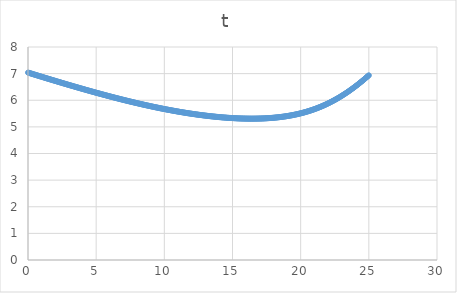
| Category | t |
|---|---|
| 0.0 | 7.04 |
| 0.05 | 7.032 |
| 0.1 | 7.024 |
| 0.15000000000000002 | 7.016 |
| 0.2 | 7.008 |
| 0.25 | 7 |
| 0.3 | 6.992 |
| 0.35 | 6.984 |
| 0.39999999999999997 | 6.976 |
| 0.44999999999999996 | 6.968 |
| 0.49999999999999994 | 6.96 |
| 0.5499999999999999 | 6.952 |
| 0.6 | 6.945 |
| 0.65 | 6.937 |
| 0.7000000000000001 | 6.929 |
| 0.7500000000000001 | 6.921 |
| 0.8000000000000002 | 6.913 |
| 0.8500000000000002 | 6.905 |
| 0.9000000000000002 | 6.897 |
| 0.9500000000000003 | 6.89 |
| 1.0000000000000002 | 6.882 |
| 1.0500000000000003 | 6.874 |
| 1.1000000000000003 | 6.866 |
| 1.1500000000000004 | 6.858 |
| 1.2000000000000004 | 6.85 |
| 1.2500000000000004 | 6.843 |
| 1.3000000000000005 | 6.835 |
| 1.3500000000000005 | 6.827 |
| 1.4000000000000006 | 6.819 |
| 1.4500000000000006 | 6.812 |
| 1.5000000000000007 | 6.804 |
| 1.5500000000000007 | 6.796 |
| 1.6000000000000008 | 6.788 |
| 1.6500000000000008 | 6.781 |
| 1.7000000000000008 | 6.773 |
| 1.7500000000000009 | 6.765 |
| 1.800000000000001 | 6.757 |
| 1.850000000000001 | 6.75 |
| 1.900000000000001 | 6.742 |
| 1.950000000000001 | 6.734 |
| 2.000000000000001 | 6.727 |
| 2.0500000000000007 | 6.719 |
| 2.1000000000000005 | 6.711 |
| 2.1500000000000004 | 6.704 |
| 2.2 | 6.696 |
| 2.25 | 6.688 |
| 2.3 | 6.681 |
| 2.3499999999999996 | 6.673 |
| 2.3999999999999995 | 6.665 |
| 2.4499999999999993 | 6.658 |
| 2.499999999999999 | 6.65 |
| 2.549999999999999 | 6.643 |
| 2.5999999999999988 | 6.635 |
| 2.6499999999999986 | 6.628 |
| 2.6999999999999984 | 6.62 |
| 2.7499999999999982 | 6.612 |
| 2.799999999999998 | 6.605 |
| 2.849999999999998 | 6.597 |
| 2.8999999999999977 | 6.59 |
| 2.9499999999999975 | 6.582 |
| 2.9999999999999973 | 6.575 |
| 3.049999999999997 | 6.567 |
| 3.099999999999997 | 6.56 |
| 3.149999999999997 | 6.552 |
| 3.1999999999999966 | 6.545 |
| 3.2499999999999964 | 6.537 |
| 3.2999999999999963 | 6.53 |
| 3.349999999999996 | 6.523 |
| 3.399999999999996 | 6.515 |
| 3.4499999999999957 | 6.508 |
| 3.4999999999999956 | 6.5 |
| 3.5499999999999954 | 6.493 |
| 3.599999999999995 | 6.485 |
| 3.649999999999995 | 6.478 |
| 3.699999999999995 | 6.471 |
| 3.7499999999999947 | 6.463 |
| 3.7999999999999945 | 6.456 |
| 3.8499999999999943 | 6.449 |
| 3.899999999999994 | 6.441 |
| 3.949999999999994 | 6.434 |
| 3.999999999999994 | 6.427 |
| 4.049999999999994 | 6.419 |
| 4.099999999999993 | 6.412 |
| 4.149999999999993 | 6.405 |
| 4.199999999999993 | 6.398 |
| 4.249999999999993 | 6.39 |
| 4.299999999999993 | 6.383 |
| 4.3499999999999925 | 6.376 |
| 4.399999999999992 | 6.369 |
| 4.449999999999992 | 6.362 |
| 4.499999999999992 | 6.354 |
| 4.549999999999992 | 6.347 |
| 4.599999999999992 | 6.34 |
| 4.6499999999999915 | 6.333 |
| 4.699999999999991 | 6.326 |
| 4.749999999999991 | 6.319 |
| 4.799999999999991 | 6.312 |
| 4.849999999999991 | 6.305 |
| 4.899999999999991 | 6.297 |
| 4.94999999999999 | 6.29 |
| 4.99999999999999 | 6.283 |
| 5.04999999999999 | 6.276 |
| 5.09999999999999 | 6.269 |
| 5.14999999999999 | 6.262 |
| 5.1999999999999895 | 6.255 |
| 5.249999999999989 | 6.248 |
| 5.299999999999989 | 6.241 |
| 5.349999999999989 | 6.234 |
| 5.399999999999989 | 6.227 |
| 5.449999999999989 | 6.221 |
| 5.4999999999999885 | 6.214 |
| 5.549999999999988 | 6.207 |
| 5.599999999999988 | 6.2 |
| 5.649999999999988 | 6.193 |
| 5.699999999999988 | 6.186 |
| 5.749999999999988 | 6.179 |
| 5.799999999999987 | 6.173 |
| 5.849999999999987 | 6.166 |
| 5.899999999999987 | 6.159 |
| 5.949999999999987 | 6.152 |
| 5.999999999999987 | 6.145 |
| 6.0499999999999865 | 6.139 |
| 6.099999999999986 | 6.132 |
| 6.149999999999986 | 6.125 |
| 6.199999999999986 | 6.119 |
| 6.249999999999986 | 6.112 |
| 6.299999999999986 | 6.105 |
| 6.349999999999985 | 6.099 |
| 6.399999999999985 | 6.092 |
| 6.449999999999985 | 6.085 |
| 6.499999999999985 | 6.079 |
| 6.549999999999985 | 6.072 |
| 6.5999999999999845 | 6.066 |
| 6.649999999999984 | 6.059 |
| 6.699999999999984 | 6.053 |
| 6.749999999999984 | 6.046 |
| 6.799999999999984 | 6.04 |
| 6.849999999999984 | 6.033 |
| 6.8999999999999835 | 6.027 |
| 6.949999999999983 | 6.021 |
| 6.999999999999983 | 6.014 |
| 7.049999999999983 | 6.008 |
| 7.099999999999983 | 6.001 |
| 7.149999999999983 | 5.995 |
| 7.199999999999982 | 5.989 |
| 7.249999999999982 | 5.982 |
| 7.299999999999982 | 5.976 |
| 7.349999999999982 | 5.97 |
| 7.399999999999982 | 5.964 |
| 7.4499999999999815 | 5.957 |
| 7.499999999999981 | 5.951 |
| 7.549999999999981 | 5.945 |
| 7.599999999999981 | 5.939 |
| 7.649999999999981 | 5.933 |
| 7.699999999999981 | 5.927 |
| 7.7499999999999805 | 5.921 |
| 7.79999999999998 | 5.914 |
| 7.84999999999998 | 5.908 |
| 7.89999999999998 | 5.902 |
| 7.94999999999998 | 5.896 |
| 7.99999999999998 | 5.89 |
| 8.04999999999998 | 5.884 |
| 8.09999999999998 | 5.878 |
| 8.14999999999998 | 5.873 |
| 8.199999999999982 | 5.867 |
| 8.249999999999982 | 5.861 |
| 8.299999999999983 | 5.855 |
| 8.349999999999984 | 5.849 |
| 8.399999999999984 | 5.843 |
| 8.449999999999985 | 5.837 |
| 8.499999999999986 | 5.832 |
| 8.549999999999986 | 5.826 |
| 8.599999999999987 | 5.82 |
| 8.649999999999988 | 5.815 |
| 8.699999999999989 | 5.809 |
| 8.74999999999999 | 5.803 |
| 8.79999999999999 | 5.798 |
| 8.84999999999999 | 5.792 |
| 8.899999999999991 | 5.786 |
| 8.949999999999992 | 5.781 |
| 8.999999999999993 | 5.775 |
| 9.049999999999994 | 5.77 |
| 9.099999999999994 | 5.764 |
| 9.149999999999995 | 5.759 |
| 9.199999999999996 | 5.753 |
| 9.249999999999996 | 5.748 |
| 9.299999999999997 | 5.743 |
| 9.349999999999998 | 5.737 |
| 9.399999999999999 | 5.732 |
| 9.45 | 5.727 |
| 9.5 | 5.721 |
| 9.55 | 5.716 |
| 9.600000000000001 | 5.711 |
| 9.650000000000002 | 5.706 |
| 9.700000000000003 | 5.701 |
| 9.750000000000004 | 5.695 |
| 9.800000000000004 | 5.69 |
| 9.850000000000005 | 5.685 |
| 9.900000000000006 | 5.68 |
| 9.950000000000006 | 5.675 |
| 10.000000000000007 | 5.67 |
| 10.050000000000008 | 5.665 |
| 10.100000000000009 | 5.66 |
| 10.15000000000001 | 5.655 |
| 10.20000000000001 | 5.65 |
| 10.25000000000001 | 5.645 |
| 10.300000000000011 | 5.641 |
| 10.350000000000012 | 5.636 |
| 10.400000000000013 | 5.631 |
| 10.450000000000014 | 5.626 |
| 10.500000000000014 | 5.621 |
| 10.550000000000015 | 5.617 |
| 10.600000000000016 | 5.612 |
| 10.650000000000016 | 5.607 |
| 10.700000000000017 | 5.603 |
| 10.750000000000018 | 5.598 |
| 10.800000000000018 | 5.594 |
| 10.85000000000002 | 5.589 |
| 10.90000000000002 | 5.584 |
| 10.95000000000002 | 5.58 |
| 11.000000000000021 | 5.576 |
| 11.050000000000022 | 5.571 |
| 11.100000000000023 | 5.567 |
| 11.150000000000023 | 5.562 |
| 11.200000000000024 | 5.558 |
| 11.250000000000025 | 5.554 |
| 11.300000000000026 | 5.549 |
| 11.350000000000026 | 5.545 |
| 11.400000000000027 | 5.541 |
| 11.450000000000028 | 5.537 |
| 11.500000000000028 | 5.533 |
| 11.55000000000003 | 5.529 |
| 11.60000000000003 | 5.525 |
| 11.65000000000003 | 5.52 |
| 11.700000000000031 | 5.516 |
| 11.750000000000032 | 5.512 |
| 11.800000000000033 | 5.508 |
| 11.850000000000033 | 5.505 |
| 11.900000000000034 | 5.501 |
| 11.950000000000035 | 5.497 |
| 12.000000000000036 | 5.493 |
| 12.050000000000036 | 5.489 |
| 12.100000000000037 | 5.485 |
| 12.150000000000038 | 5.482 |
| 12.200000000000038 | 5.478 |
| 12.250000000000039 | 5.474 |
| 12.30000000000004 | 5.471 |
| 12.35000000000004 | 5.467 |
| 12.400000000000041 | 5.464 |
| 12.450000000000042 | 5.46 |
| 12.500000000000043 | 5.457 |
| 12.550000000000043 | 5.453 |
| 12.600000000000044 | 5.45 |
| 12.650000000000045 | 5.446 |
| 12.700000000000045 | 5.443 |
| 12.750000000000046 | 5.44 |
| 12.800000000000047 | 5.436 |
| 12.850000000000048 | 5.433 |
| 12.900000000000048 | 5.43 |
| 12.950000000000049 | 5.427 |
| 13.00000000000005 | 5.424 |
| 13.05000000000005 | 5.42 |
| 13.100000000000051 | 5.417 |
| 13.150000000000052 | 5.414 |
| 13.200000000000053 | 5.411 |
| 13.250000000000053 | 5.408 |
| 13.300000000000054 | 5.405 |
| 13.350000000000055 | 5.403 |
| 13.400000000000055 | 5.4 |
| 13.450000000000056 | 5.397 |
| 13.500000000000057 | 5.394 |
| 13.550000000000058 | 5.391 |
| 13.600000000000058 | 5.389 |
| 13.650000000000059 | 5.386 |
| 13.70000000000006 | 5.383 |
| 13.75000000000006 | 5.381 |
| 13.800000000000061 | 5.378 |
| 13.850000000000062 | 5.376 |
| 13.900000000000063 | 5.373 |
| 13.950000000000063 | 5.371 |
| 14.000000000000064 | 5.369 |
| 14.050000000000065 | 5.366 |
| 14.100000000000065 | 5.364 |
| 14.150000000000066 | 5.362 |
| 14.200000000000067 | 5.359 |
| 14.250000000000068 | 5.357 |
| 14.300000000000068 | 5.355 |
| 14.350000000000069 | 5.353 |
| 14.40000000000007 | 5.351 |
| 14.45000000000007 | 5.349 |
| 14.500000000000071 | 5.347 |
| 14.550000000000072 | 5.345 |
| 14.600000000000072 | 5.343 |
| 14.650000000000073 | 5.342 |
| 14.700000000000074 | 5.34 |
| 14.750000000000075 | 5.338 |
| 14.800000000000075 | 5.336 |
| 14.850000000000076 | 5.335 |
| 14.900000000000077 | 5.333 |
| 14.950000000000077 | 5.332 |
| 15.000000000000078 | 5.33 |
| 15.050000000000079 | 5.329 |
| 15.10000000000008 | 5.327 |
| 15.15000000000008 | 5.326 |
| 15.200000000000081 | 5.324 |
| 15.250000000000082 | 5.323 |
| 15.300000000000082 | 5.322 |
| 15.350000000000083 | 5.321 |
| 15.400000000000084 | 5.32 |
| 15.450000000000085 | 5.319 |
| 15.500000000000085 | 5.318 |
| 15.550000000000086 | 5.317 |
| 15.600000000000087 | 5.316 |
| 15.650000000000087 | 5.315 |
| 15.700000000000088 | 5.314 |
| 15.750000000000089 | 5.313 |
| 15.80000000000009 | 5.313 |
| 15.85000000000009 | 5.312 |
| 15.900000000000091 | 5.311 |
| 15.950000000000092 | 5.311 |
| 16.000000000000092 | 5.31 |
| 16.050000000000093 | 5.31 |
| 16.100000000000094 | 5.309 |
| 16.150000000000095 | 5.309 |
| 16.200000000000095 | 5.309 |
| 16.250000000000096 | 5.309 |
| 16.300000000000097 | 5.309 |
| 16.350000000000097 | 5.308 |
| 16.400000000000098 | 5.308 |
| 16.4500000000001 | 5.308 |
| 16.5000000000001 | 5.309 |
| 16.5500000000001 | 5.309 |
| 16.6000000000001 | 5.309 |
| 16.6500000000001 | 5.309 |
| 16.700000000000102 | 5.309 |
| 16.750000000000103 | 5.31 |
| 16.800000000000104 | 5.31 |
| 16.850000000000104 | 5.311 |
| 16.900000000000105 | 5.311 |
| 16.950000000000106 | 5.312 |
| 17.000000000000107 | 5.313 |
| 17.050000000000107 | 5.314 |
| 17.100000000000108 | 5.314 |
| 17.15000000000011 | 5.315 |
| 17.20000000000011 | 5.316 |
| 17.25000000000011 | 5.317 |
| 17.30000000000011 | 5.319 |
| 17.35000000000011 | 5.32 |
| 17.400000000000112 | 5.321 |
| 17.450000000000113 | 5.322 |
| 17.500000000000114 | 5.324 |
| 17.550000000000114 | 5.325 |
| 17.600000000000115 | 5.327 |
| 17.650000000000116 | 5.329 |
| 17.700000000000117 | 5.33 |
| 17.750000000000117 | 5.332 |
| 17.800000000000118 | 5.334 |
| 17.85000000000012 | 5.336 |
| 17.90000000000012 | 5.338 |
| 17.95000000000012 | 5.34 |
| 18.00000000000012 | 5.342 |
| 18.05000000000012 | 5.345 |
| 18.100000000000122 | 5.347 |
| 18.150000000000123 | 5.349 |
| 18.200000000000124 | 5.352 |
| 18.250000000000124 | 5.355 |
| 18.300000000000125 | 5.357 |
| 18.350000000000126 | 5.36 |
| 18.400000000000126 | 5.363 |
| 18.450000000000127 | 5.366 |
| 18.500000000000128 | 5.369 |
| 18.55000000000013 | 5.372 |
| 18.60000000000013 | 5.375 |
| 18.65000000000013 | 5.379 |
| 18.70000000000013 | 5.382 |
| 18.75000000000013 | 5.386 |
| 18.800000000000132 | 5.389 |
| 18.850000000000133 | 5.393 |
| 18.900000000000134 | 5.397 |
| 18.950000000000134 | 5.401 |
| 19.000000000000135 | 5.405 |
| 19.050000000000136 | 5.409 |
| 19.100000000000136 | 5.413 |
| 19.150000000000137 | 5.418 |
| 19.200000000000138 | 5.422 |
| 19.25000000000014 | 5.427 |
| 19.30000000000014 | 5.431 |
| 19.35000000000014 | 5.436 |
| 19.40000000000014 | 5.441 |
| 19.45000000000014 | 5.446 |
| 19.500000000000142 | 5.451 |
| 19.550000000000143 | 5.456 |
| 19.600000000000144 | 5.462 |
| 19.650000000000144 | 5.467 |
| 19.700000000000145 | 5.473 |
| 19.750000000000146 | 5.479 |
| 19.800000000000146 | 5.484 |
| 19.850000000000147 | 5.49 |
| 19.900000000000148 | 5.496 |
| 19.95000000000015 | 5.503 |
| 20.00000000000015 | 5.509 |
| 20.05000000000015 | 5.515 |
| 20.10000000000015 | 5.522 |
| 20.15000000000015 | 5.529 |
| 20.200000000000152 | 5.536 |
| 20.250000000000153 | 5.543 |
| 20.300000000000153 | 5.55 |
| 20.350000000000154 | 5.557 |
| 20.400000000000155 | 5.564 |
| 20.450000000000156 | 5.572 |
| 20.500000000000156 | 5.579 |
| 20.550000000000157 | 5.587 |
| 20.600000000000158 | 5.595 |
| 20.65000000000016 | 5.603 |
| 20.70000000000016 | 5.611 |
| 20.75000000000016 | 5.62 |
| 20.80000000000016 | 5.628 |
| 20.85000000000016 | 5.637 |
| 20.900000000000162 | 5.646 |
| 20.950000000000163 | 5.655 |
| 21.000000000000163 | 5.664 |
| 21.050000000000164 | 5.673 |
| 21.100000000000165 | 5.682 |
| 21.150000000000166 | 5.692 |
| 21.200000000000166 | 5.702 |
| 21.250000000000167 | 5.712 |
| 21.300000000000168 | 5.722 |
| 21.35000000000017 | 5.732 |
| 21.40000000000017 | 5.742 |
| 21.45000000000017 | 5.753 |
| 21.50000000000017 | 5.763 |
| 21.55000000000017 | 5.774 |
| 21.600000000000172 | 5.785 |
| 21.650000000000173 | 5.796 |
| 21.700000000000173 | 5.807 |
| 21.750000000000174 | 5.819 |
| 21.800000000000175 | 5.831 |
| 21.850000000000176 | 5.842 |
| 21.900000000000176 | 5.854 |
| 21.950000000000177 | 5.867 |
| 22.000000000000178 | 5.879 |
| 22.05000000000018 | 5.891 |
| 22.10000000000018 | 5.904 |
| 22.15000000000018 | 5.917 |
| 22.20000000000018 | 5.93 |
| 22.25000000000018 | 5.943 |
| 22.300000000000182 | 5.956 |
| 22.350000000000183 | 5.97 |
| 22.400000000000183 | 5.984 |
| 22.450000000000184 | 5.997 |
| 22.500000000000185 | 6.011 |
| 22.550000000000185 | 6.026 |
| 22.600000000000186 | 6.04 |
| 22.650000000000187 | 6.055 |
| 22.700000000000188 | 6.069 |
| 22.75000000000019 | 6.084 |
| 22.80000000000019 | 6.099 |
| 22.85000000000019 | 6.115 |
| 22.90000000000019 | 6.13 |
| 22.95000000000019 | 6.146 |
| 23.000000000000192 | 6.162 |
| 23.050000000000193 | 6.178 |
| 23.100000000000193 | 6.194 |
| 23.150000000000194 | 6.21 |
| 23.200000000000195 | 6.227 |
| 23.250000000000195 | 6.243 |
| 23.300000000000196 | 6.26 |
| 23.350000000000197 | 6.277 |
| 23.400000000000198 | 6.295 |
| 23.4500000000002 | 6.312 |
| 23.5000000000002 | 6.33 |
| 23.5500000000002 | 6.347 |
| 23.6000000000002 | 6.365 |
| 23.6500000000002 | 6.383 |
| 23.700000000000202 | 6.402 |
| 23.750000000000203 | 6.42 |
| 23.800000000000203 | 6.439 |
| 23.850000000000204 | 6.458 |
| 23.900000000000205 | 6.477 |
| 23.950000000000205 | 6.496 |
| 24.000000000000206 | 6.515 |
| 24.050000000000207 | 6.535 |
| 24.100000000000207 | 6.554 |
| 24.150000000000208 | 6.574 |
| 24.20000000000021 | 6.594 |
| 24.25000000000021 | 6.614 |
| 24.30000000000021 | 6.635 |
| 24.35000000000021 | 6.655 |
| 24.40000000000021 | 6.676 |
| 24.450000000000212 | 6.697 |
| 24.500000000000213 | 6.718 |
| 24.550000000000214 | 6.739 |
| 24.600000000000215 | 6.76 |
| 24.650000000000215 | 6.782 |
| 24.700000000000216 | 6.804 |
| 24.750000000000217 | 6.825 |
| 24.800000000000217 | 6.848 |
| 24.850000000000218 | 6.87 |
| 24.90000000000022 | 6.892 |
| 24.95000000000022 | 6.915 |
| 25.00000000000022 | 6.937 |